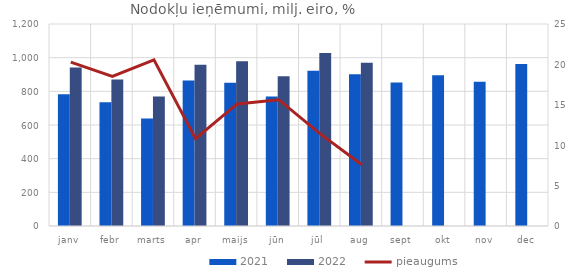
| Category | 2021 | 2022 |
|---|---|---|
| janv | 782.986 | 941.792 |
| febr | 734.852 | 870.815 |
| marts | 637.892 | 769.055 |
| apr | 864.35 | 957.835 |
| maijs | 850.253 | 978.679 |
| jūn | 768.738 | 888.916 |
| jūl | 922.262 | 1027.457 |
| aug | 901.674 | 969.994 |
| sept | 852.726 | 0 |
| okt | 895.874 | 0 |
| nov | 856.461 | 0 |
| dec | 962.936 | 0 |